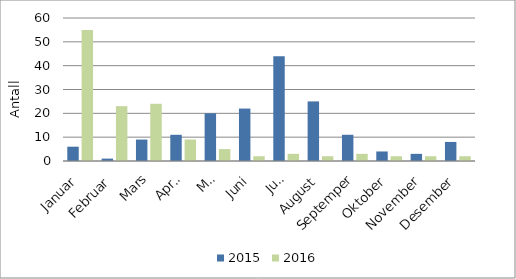
| Category | 2015 | 2016 |
|---|---|---|
| Januar | 6 | 55 |
| Februar | 1 | 23 |
| Mars | 9 | 24 |
| April | 11 | 9 |
| Mai | 20 | 5 |
| Juni | 22 | 2 |
| Juli | 44 | 3 |
| August | 25 | 2 |
| Septemper | 11 | 3 |
| Oktober | 4 | 2 |
| November | 3 | 2 |
| Desember | 8 | 2 |